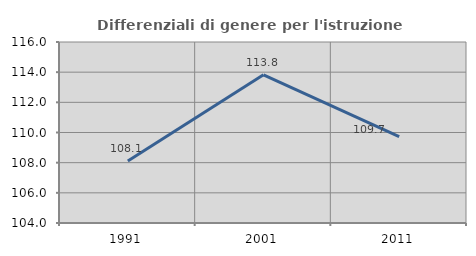
| Category | Differenziali di genere per l'istruzione superiore |
|---|---|
| 1991.0 | 108.108 |
| 2001.0 | 113.823 |
| 2011.0 | 109.724 |